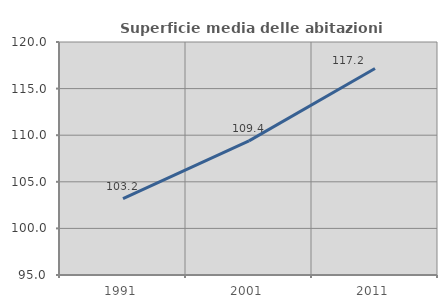
| Category | Superficie media delle abitazioni occupate |
|---|---|
| 1991.0 | 103.191 |
| 2001.0 | 109.391 |
| 2011.0 | 117.161 |